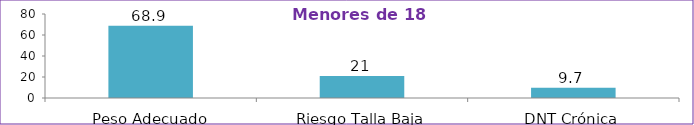
| Category | Series 0 |
|---|---|
| Peso Adecuado | 68.9 |
| Riesgo Talla Baja | 21 |
| DNT Crónica | 9.7 |